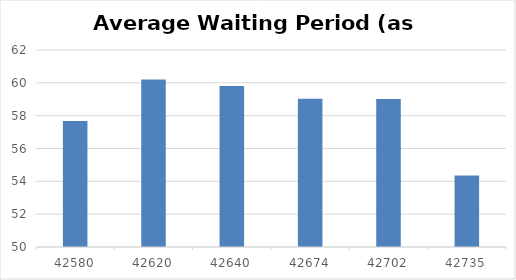
| Category | Series 0 |
|---|---|
| 7/29/16 | 57.68 |
| 9/7/16 | 60.2 |
| 9/27/16 | 59.8 |
| 10/31/16 | 59.03 |
| 11/28/16 | 59.02 |
| 12/31/16 | 54.35 |